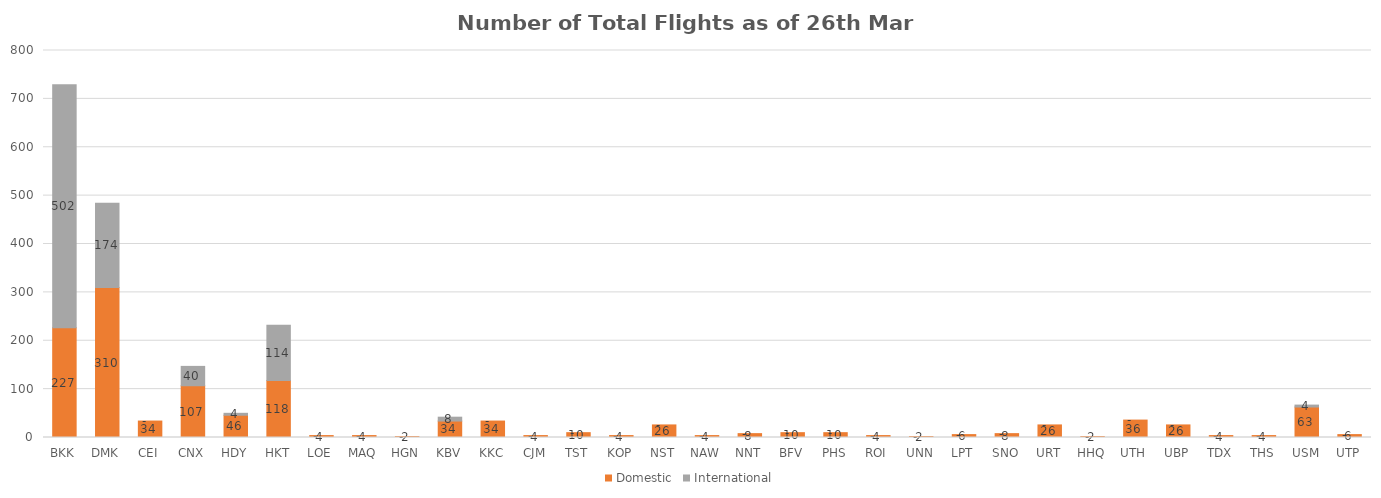
| Category | Domestic | International |
|---|---|---|
| BKK | 227 | 502 |
| DMK | 310 | 174 |
| CEI | 34 | 0 |
| CNX | 107 | 40 |
| HDY | 46 | 4 |
| HKT | 118 | 114 |
| LOE | 4 | 0 |
| MAQ | 4 | 0 |
| HGN | 2 | 0 |
| KBV | 34 | 8 |
| KKC | 34 | 0 |
| CJM | 4 | 0 |
| TST | 10 | 0 |
| KOP | 4 | 0 |
| NST | 26 | 0 |
| NAW | 4 | 0 |
| NNT | 8 | 0 |
| BFV | 10 | 0 |
| PHS | 10 | 0 |
| ROI | 4 | 0 |
| UNN | 2 | 0 |
| LPT | 6 | 0 |
| SNO | 8 | 0 |
| URT | 26 | 0 |
| HHQ | 2 | 0 |
| UTH | 36 | 0 |
| UBP | 26 | 0 |
| TDX | 4 | 0 |
| THS | 4 | 0 |
| USM | 63 | 4 |
| UTP | 6 | 0 |